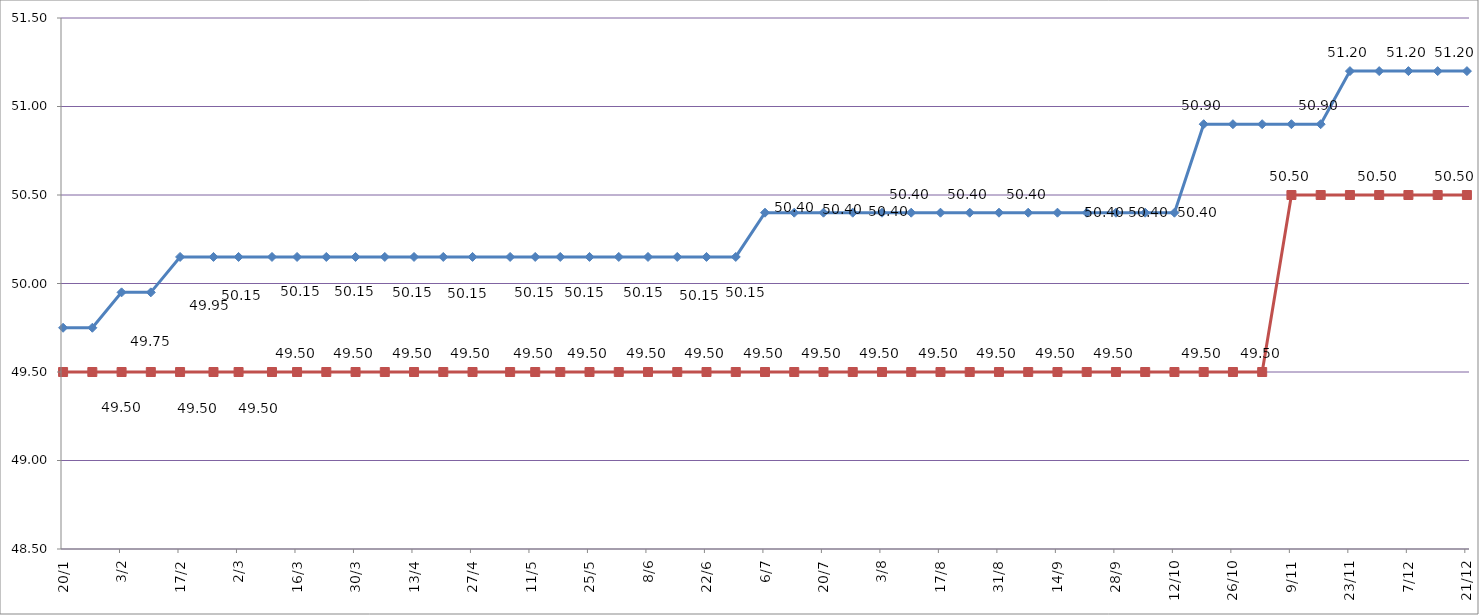
| Category | Кривошеино | Володино |
|---|---|---|
| 2020-01-20 | 49.75 | 49.5 |
| 2020-01-27 | 49.75 | 49.5 |
| 2020-02-03 | 49.95 | 49.5 |
| 2020-02-10 | 49.95 | 49.5 |
| 2020-02-17 | 50.15 | 49.5 |
| 2020-02-25 | 50.15 | 49.5 |
| 2020-03-02 | 50.15 | 49.5 |
| 2020-03-10 | 50.15 | 49.5 |
| 2020-03-16 | 50.15 | 49.5 |
| 2020-03-23 | 50.15 | 49.5 |
| 2020-03-30 | 50.15 | 49.5 |
| 2020-04-06 | 50.15 | 49.5 |
| 2020-04-13 | 50.15 | 49.5 |
| 2020-04-20 | 50.15 | 49.5 |
| 2020-04-27 | 50.15 | 49.5 |
| 2020-05-06 | 50.15 | 49.5 |
| 2020-05-12 | 50.15 | 49.5 |
| 2020-05-18 | 50.15 | 49.5 |
| 2020-05-25 | 50.15 | 49.5 |
| 2020-06-01 | 50.15 | 49.5 |
| 2020-06-08 | 50.15 | 49.5 |
| 2020-06-15 | 50.15 | 49.5 |
| 2020-06-22 | 50.15 | 49.5 |
| 2020-06-29 | 50.15 | 49.5 |
| 2020-07-06 | 50.4 | 49.5 |
| 2020-07-13 | 50.4 | 49.5 |
| 2020-07-20 | 50.4 | 49.5 |
| 2020-07-27 | 50.4 | 49.5 |
| 2020-08-03 | 50.4 | 49.5 |
| 2020-08-10 | 50.4 | 49.5 |
| 2020-08-17 | 50.4 | 49.5 |
| 2020-08-24 | 50.4 | 49.5 |
| 2020-08-31 | 50.4 | 49.5 |
| 2020-09-07 | 50.4 | 49.5 |
| 2020-09-14 | 50.4 | 49.5 |
| 2020-09-21 | 50.4 | 49.5 |
| 2020-09-28 | 50.4 | 49.5 |
| 2020-10-05 | 50.4 | 49.5 |
| 2020-10-12 | 50.4 | 49.5 |
| 2020-10-19 | 50.9 | 49.5 |
| 2020-10-26 | 50.9 | 49.5 |
| 2020-11-02 | 50.9 | 49.5 |
| 2020-11-09 | 50.9 | 50.5 |
| 2020-11-16 | 50.9 | 50.5 |
| 2020-11-23 | 51.2 | 50.5 |
| 2020-11-30 | 51.2 | 50.5 |
| 2020-12-07 | 51.2 | 50.5 |
| 2020-12-14 | 51.2 | 50.5 |
| 2020-12-21 | 51.2 | 50.5 |